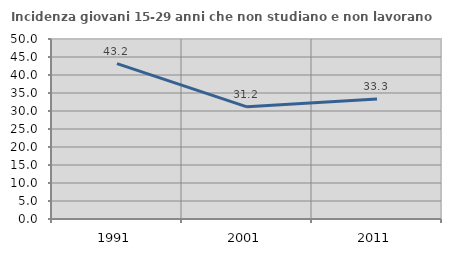
| Category | Incidenza giovani 15-29 anni che non studiano e non lavorano  |
|---|---|
| 1991.0 | 43.175 |
| 2001.0 | 31.156 |
| 2011.0 | 33.333 |